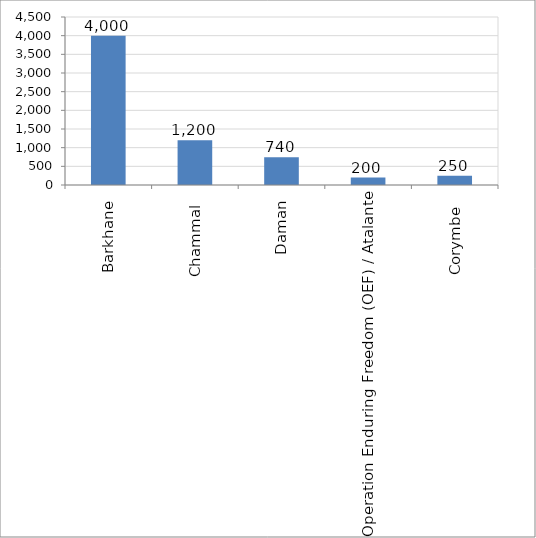
| Category | Series 0 |
|---|---|
| Barkhane | 4000 |
| Chammal  | 1200 |
| Daman | 740 |
| Operation Enduring Freedom (OEF) / Atalante | 200 |
| Corymbe  | 250 |